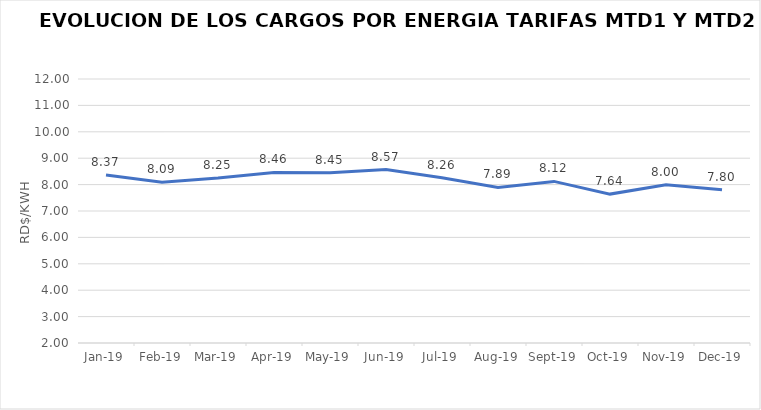
| Category | Series 0 |
|---|---|
| 2019-01-01 | 8.367 |
| 2019-02-01 | 8.093 |
| 2019-03-01 | 8.251 |
| 2019-04-01 | 8.46 |
| 2019-05-01 | 8.45 |
| 2019-06-01 | 8.57 |
| 2019-07-01 | 8.26 |
| 2019-08-01 | 7.895 |
| 2019-09-01 | 8.121 |
| 2019-10-01 | 7.64 |
| 2019-11-01 | 7.998 |
| 2019-12-01 | 7.8 |